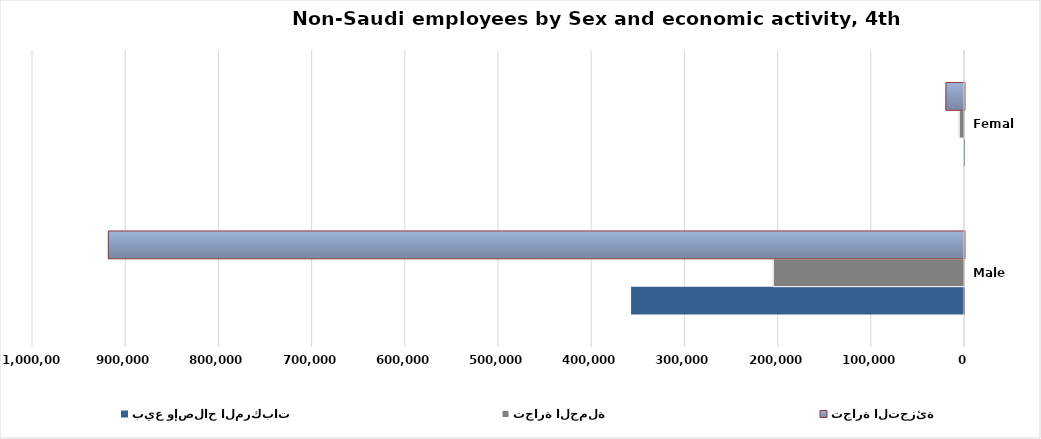
| Category | بيع وإصلاح المركبات  | تجارة الجملة | تجارة التجزئة |
|---|---|---|---|
| Male | 357230 | 205122 | 918590 |
| Female | 170 | 5574 | 19893 |